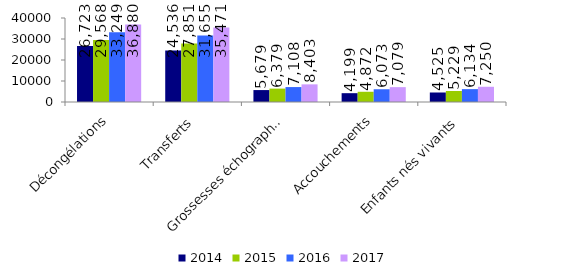
| Category | 2014 | 2015 | 2016 | 2017 |
|---|---|---|---|---|
| Décongélations | 26723 | 29568 | 33249 | 36880 |
| Transferts | 24536 | 27851 | 31655 | 35471 |
| Grossesses échographiques | 5679 | 6379 | 7108 | 8403 |
| Accouchements | 4199 | 4872 | 6073 | 7079 |
| Enfants nés vivants | 4525 | 5229 | 6134 | 7250 |